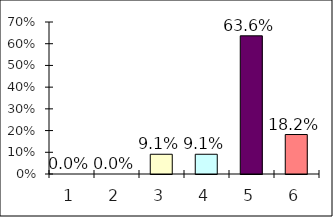
| Category | Series 0 |
|---|---|
| 0 | 0 |
| 1 | 0 |
| 2 | 0.091 |
| 3 | 0.091 |
| 4 | 0.636 |
| 5 | 0.182 |